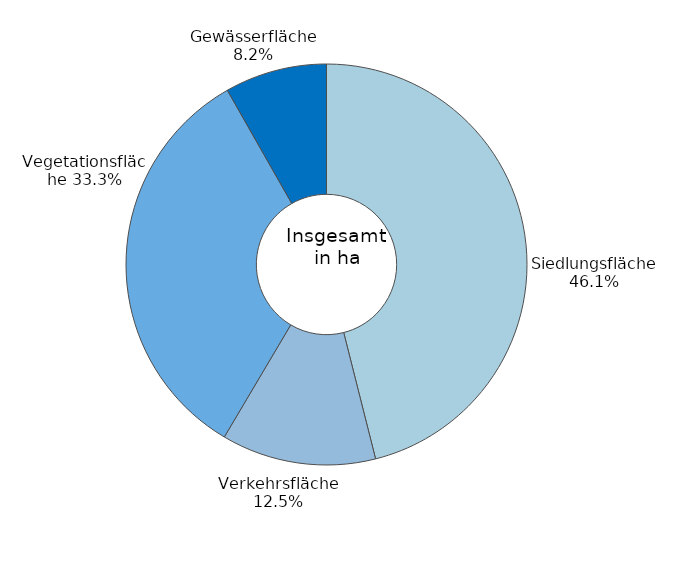
| Category | Series 0 |
|---|---|
| Siedlungsfläche | 0.461 |
| Verkehrsfläche | 0.125 |
| Vegetationsfläche | 0.333 |
| Gewässerfläche | 0.082 |